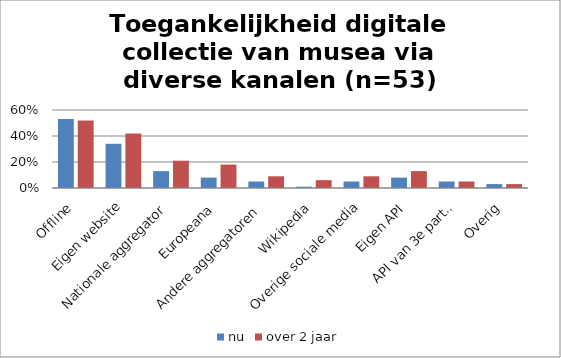
| Category | nu | over 2 jaar |
|---|---|---|
| Offline | 0.53 | 0.52 |
| Eigen website | 0.34 | 0.42 |
| Nationale aggregator | 0.13 | 0.21 |
| Europeana | 0.08 | 0.18 |
| Andere aggregatoren | 0.05 | 0.09 |
| Wikipedia | 0.01 | 0.06 |
| Overige sociale media | 0.05 | 0.09 |
| Eigen API | 0.08 | 0.13 |
| API van 3e partij | 0.05 | 0.05 |
| Overig | 0.03 | 0.03 |